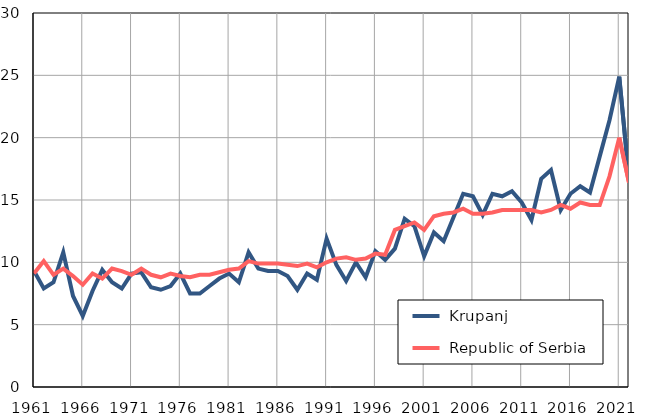
| Category |  Krupanj |  Republic of Serbia |
|---|---|---|
| 1961.0 | 9.3 | 9.1 |
| 1962.0 | 7.9 | 10.1 |
| 1963.0 | 8.4 | 9 |
| 1964.0 | 10.8 | 9.5 |
| 1965.0 | 7.3 | 8.9 |
| 1966.0 | 5.7 | 8.2 |
| 1967.0 | 7.7 | 9.1 |
| 1968.0 | 9.4 | 8.7 |
| 1969.0 | 8.4 | 9.5 |
| 1970.0 | 7.9 | 9.3 |
| 1971.0 | 9.1 | 9 |
| 1972.0 | 9.2 | 9.5 |
| 1973.0 | 8 | 9 |
| 1974.0 | 7.8 | 8.8 |
| 1975.0 | 8.1 | 9.1 |
| 1976.0 | 9.1 | 8.9 |
| 1977.0 | 7.5 | 8.8 |
| 1978.0 | 7.5 | 9 |
| 1979.0 | 8.1 | 9 |
| 1980.0 | 8.7 | 9.2 |
| 1981.0 | 9.1 | 9.4 |
| 1982.0 | 8.4 | 9.5 |
| 1983.0 | 10.8 | 10.1 |
| 1984.0 | 9.5 | 9.9 |
| 1985.0 | 9.3 | 9.9 |
| 1986.0 | 9.3 | 9.9 |
| 1987.0 | 8.9 | 9.8 |
| 1988.0 | 7.8 | 9.7 |
| 1989.0 | 9.1 | 9.9 |
| 1990.0 | 8.6 | 9.6 |
| 1991.0 | 11.9 | 10 |
| 1992.0 | 9.8 | 10.3 |
| 1993.0 | 8.5 | 10.4 |
| 1994.0 | 10 | 10.2 |
| 1995.0 | 8.8 | 10.3 |
| 1996.0 | 10.9 | 10.7 |
| 1997.0 | 10.2 | 10.6 |
| 1998.0 | 11.1 | 12.6 |
| 1999.0 | 13.5 | 12.9 |
| 2000.0 | 12.9 | 13.2 |
| 2001.0 | 10.5 | 12.6 |
| 2002.0 | 12.4 | 13.7 |
| 2003.0 | 11.7 | 13.9 |
| 2004.0 | 13.6 | 14 |
| 2005.0 | 15.5 | 14.3 |
| 2006.0 | 15.3 | 13.9 |
| 2007.0 | 13.8 | 13.9 |
| 2008.0 | 15.5 | 14 |
| 2009.0 | 15.3 | 14.2 |
| 2010.0 | 15.7 | 14.2 |
| 2011.0 | 14.8 | 14.2 |
| 2012.0 | 13.4 | 14.2 |
| 2013.0 | 16.7 | 14 |
| 2014.0 | 17.4 | 14.2 |
| 2015.0 | 14.2 | 14.6 |
| 2016.0 | 15.5 | 14.3 |
| 2017.0 | 16.1 | 14.8 |
| 2018.0 | 15.6 | 14.6 |
| 2019.0 | 18.5 | 14.6 |
| 2020.0 | 21.4 | 16.9 |
| 2021.0 | 24.9 | 20 |
| 2022.0 | 16.7 | 16.4 |